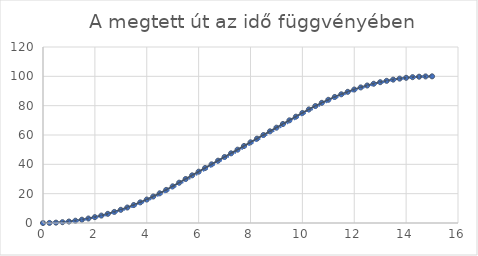
| Category | Series 0 |
|---|---|
| 0.0 | 0 |
| 0.25 | 0.062 |
| 0.5 | 0.25 |
| 0.75 | 0.562 |
| 1.0 | 1 |
| 1.25 | 1.562 |
| 1.5 | 2.25 |
| 1.75 | 3.062 |
| 2.0 | 4 |
| 2.25 | 5.062 |
| 2.5 | 6.25 |
| 2.75 | 7.562 |
| 3.0 | 9 |
| 3.25 | 10.562 |
| 3.5 | 12.25 |
| 3.75 | 14.062 |
| 4.0 | 16 |
| 4.25 | 18.062 |
| 4.5 | 20.25 |
| 4.75 | 22.562 |
| 5.0 | 25 |
| 5.25 | 27.5 |
| 5.5 | 30 |
| 5.75 | 32.5 |
| 6.0 | 35 |
| 6.25 | 37.5 |
| 6.5 | 40 |
| 6.75 | 42.5 |
| 7.0 | 45 |
| 7.25 | 47.5 |
| 7.5 | 50 |
| 7.75 | 52.5 |
| 8.0 | 55 |
| 8.25 | 57.5 |
| 8.5 | 60 |
| 8.75 | 62.5 |
| 9.0 | 65 |
| 9.25 | 67.5 |
| 9.5 | 70 |
| 9.75 | 72.5 |
| 10.0 | 75 |
| 10.25 | 77.438 |
| 10.5 | 79.75 |
| 10.75 | 81.938 |
| 11.0 | 84 |
| 11.25 | 85.938 |
| 11.5 | 87.75 |
| 11.75 | 89.438 |
| 12.0 | 91 |
| 12.25 | 92.438 |
| 12.5 | 93.75 |
| 12.75 | 94.938 |
| 13.0 | 96 |
| 13.25 | 96.938 |
| 13.5 | 97.75 |
| 13.75 | 98.438 |
| 14.0 | 99 |
| 14.25 | 99.438 |
| 14.5 | 99.75 |
| 14.75 | 99.938 |
| 15.0 | 100 |